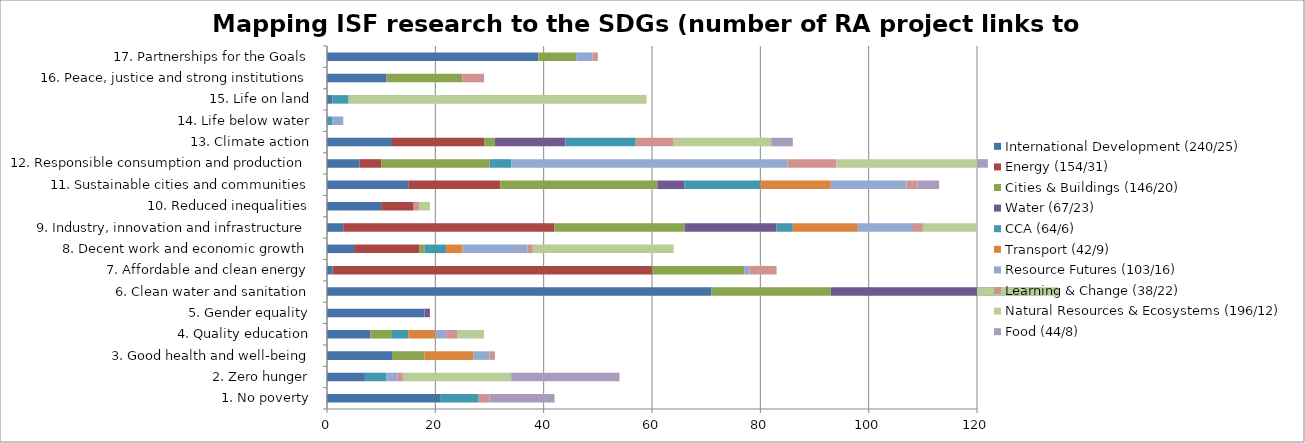
| Category | International Development (240/25) | Energy (154/31) | Cities & Buildings (146/20) | Water (67/23) | CCA (64/6) | Transport (42/9) | Resource Futures (103/16) | Learning & Change (38/22) | Natural Resources & Ecosystems (196/12) | Food (44/8) |
|---|---|---|---|---|---|---|---|---|---|---|
| 1. No poverty | 21 | 0 | 0 | 0 | 7 | 0 | 0 | 2 | 0 | 12 |
| 2. Zero hunger | 7 | 0 | 0 | 0 | 4 | 0 | 2 | 1 | 20 | 20 |
| 3. Good health and well-being | 12 | 0 | 6 | 0 | 0 | 9 | 3 | 1 | 0 | 0 |
| 4. Quality education | 8 | 0 | 4 | 0 | 3 | 5 | 2 | 2 | 5 | 0 |
| 5. Gender equality | 18 | 0 | 0 | 1 | 0 | 0 | 0 | 0 | 0 | 0 |
| 6. Clean water and sanitation | 71 | 0 | 22 | 31 | 8 | 0 | 3 | 0 | 16 | 0 |
| 7. Affordable and clean energy | 1 | 59 | 17 | 0 | 0 | 0 | 1 | 5 | 0 | 0 |
| 8. Decent work and economic growth | 5 | 12 | 1 | 0 | 4 | 3 | 12 | 1 | 26 | 0 |
| 9. Industry, innovation and infrastructure | 3 | 39 | 24 | 17 | 3 | 12 | 10 | 2 | 26 | 0 |
| 10. Reduced inequalities | 10 | 6 | 0 | 0 | 0 | 0 | 0 | 1 | 2 | 0 |
| 11. Sustainable cities and communities | 15 | 17 | 29 | 5 | 14 | 13 | 14 | 2 | 0 | 4 |
| 12. Responsible consumption and production | 6 | 4 | 20 | 0 | 4 | 0 | 51 | 9 | 28 | 4 |
| 13. Climate action | 12 | 17 | 2 | 13 | 13 | 0 | 0 | 7 | 18 | 4 |
| 14. Life below water | 0 | 0 | 0 | 0 | 1 | 0 | 2 | 0 | 0 | 0 |
| 15. Life on land | 1 | 0 | 0 | 0 | 3 | 0 | 0 | 0 | 55 | 0 |
| 16. Peace, justice and strong institutions | 11 | 0 | 14 | 0 | 0 | 0 | 0 | 4 | 0 | 0 |
| 17. Partnerships for the Goals | 39 | 0 | 7 | 0 | 0 | 0 | 3 | 1 | 0 | 0 |